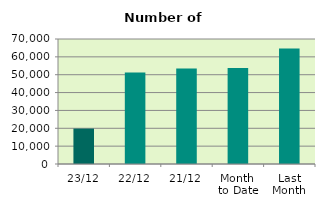
| Category | Series 0 |
|---|---|
| 23/12 | 19838 |
| 22/12 | 51272 |
| 21/12 | 53490 |
| Month 
to Date | 53805.412 |
| Last
Month | 64659.273 |